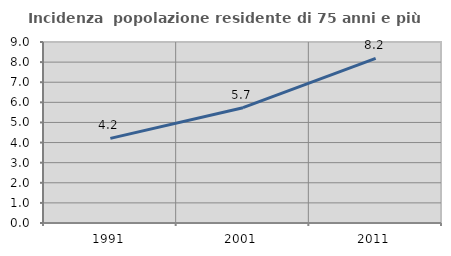
| Category | Incidenza  popolazione residente di 75 anni e più |
|---|---|
| 1991.0 | 4.208 |
| 2001.0 | 5.734 |
| 2011.0 | 8.181 |